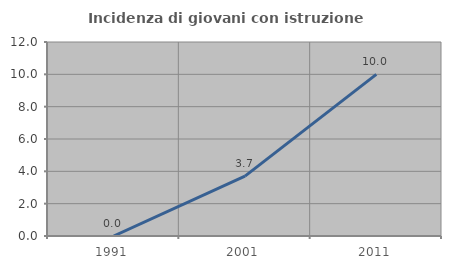
| Category | Incidenza di giovani con istruzione universitaria |
|---|---|
| 1991.0 | 0 |
| 2001.0 | 3.704 |
| 2011.0 | 10 |